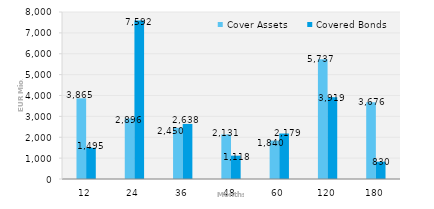
| Category | Cover Assets | Covered Bonds |
|---|---|---|
| 12.0 | 3864.858 | 1495.185 |
| 24.0 | 2895.836 | 7592 |
| 36.0 | 2449.563 | 2638 |
| 48.0 | 2131.487 | 1118 |
| 60.0 | 1839.503 | 2179 |
| 120.0 | 5736.625 | 3918.5 |
| 180.0 | 3675.865 | 830 |